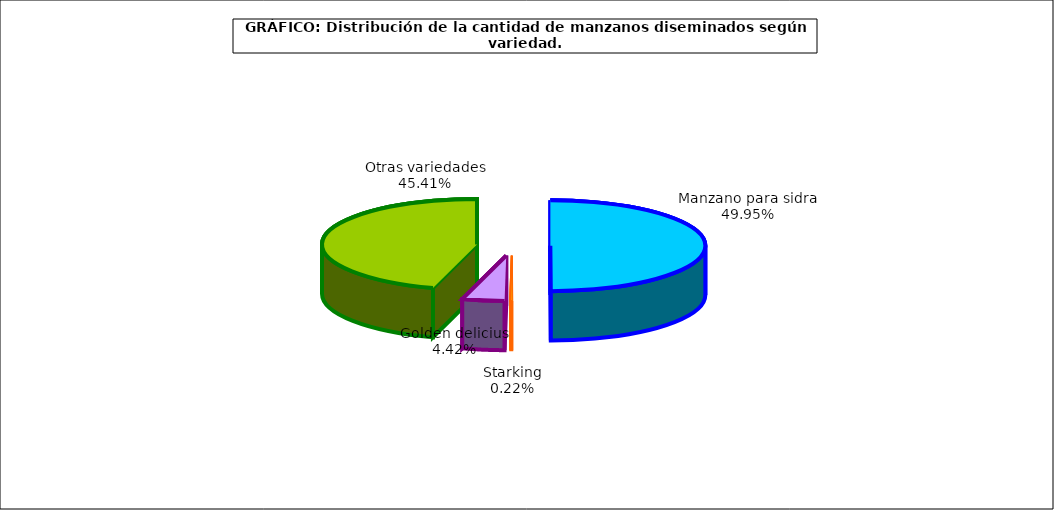
| Category | arboles |
|---|---|
| 0 | 695.095 |
| 1 | 3.014 |
| 2 | 61.447 |
| 3 | 631.932 |